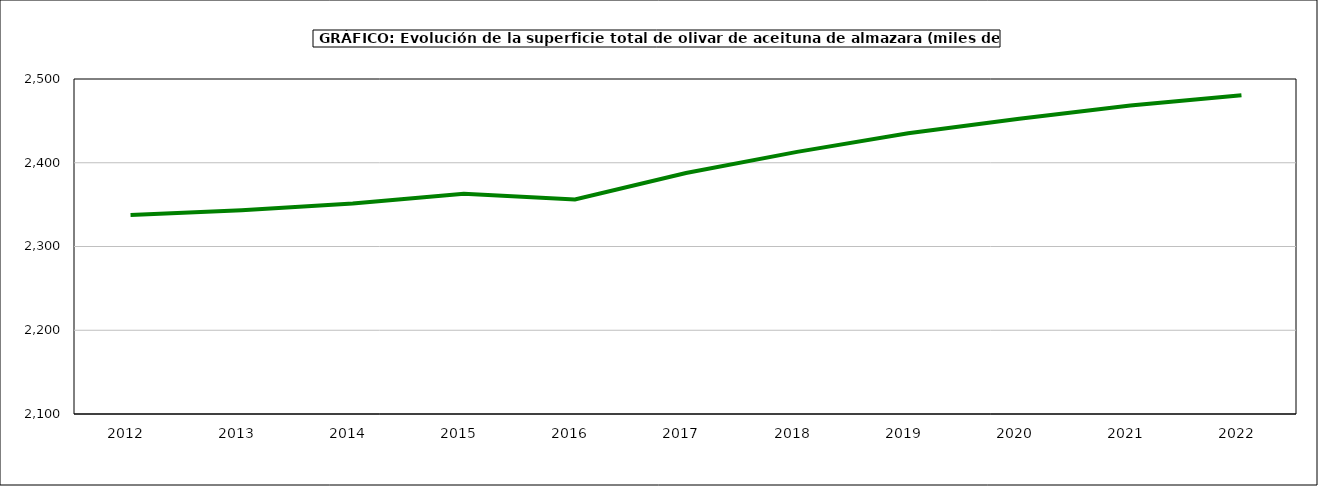
| Category | superficie |
|---|---|
| 2012.0 | 2337.582 |
| 2013.0 | 2343.184 |
| 2014.0 | 2351.428 |
| 2015.0 | 2363.082 |
| 2016.0 | 2356.047 |
| 2017.0 | 2387.832 |
| 2018.0 | 2413.021 |
| 2019.0 | 2435.127 |
| 2020.0 | 2452.569 |
| 2021.0 | 2468.464 |
| 2022.0 | 2480.633 |